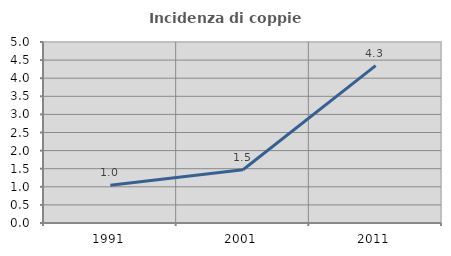
| Category | Incidenza di coppie miste |
|---|---|
| 1991.0 | 1.045 |
| 2001.0 | 1.471 |
| 2011.0 | 4.348 |